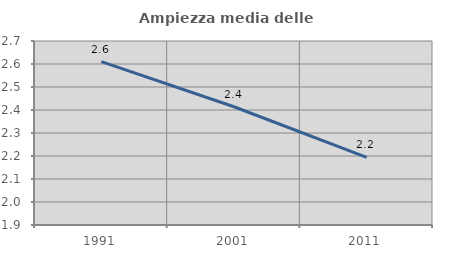
| Category | Ampiezza media delle famiglie |
|---|---|
| 1991.0 | 2.61 |
| 2001.0 | 2.414 |
| 2011.0 | 2.194 |